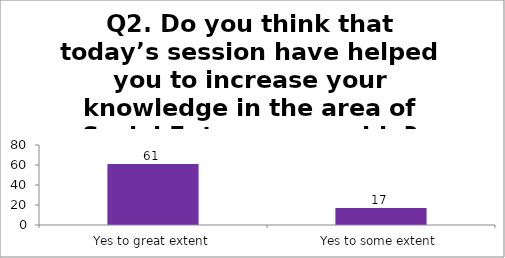
| Category | Q2. Do you think that today’s session have helped you to increase your knowledge in the area of Social Entrepreneurship? |
|---|---|
| Yes to great extent | 61 |
| Yes to some extent | 17 |